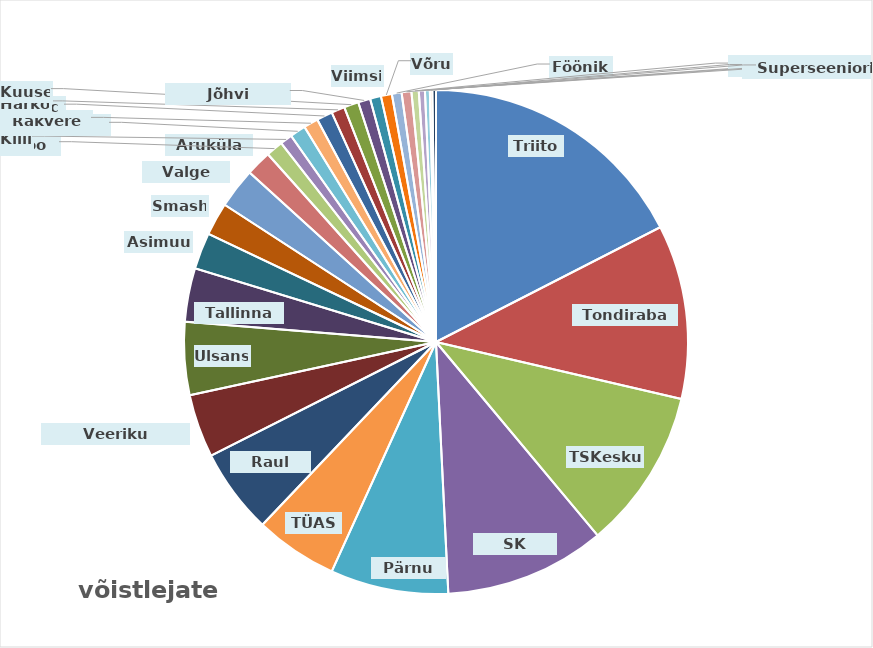
| Category | kokku |
|---|---|
| Triiton | 224 |
| Tondiraba SK | 143 |
| TSKeskus | 132 |
| SK Fookus | 132 |
| Pärnu SK | 97 |
| TÜASK | 68 |
| Raul Must | 70 |
| Veeriku Badminton | 52 |
| Ulsans | 60 |
| Tallinna SK | 44 |
| Asimuut | 30 |
| Smash | 27 |
| Valge Hani | 33 |
| Aruküla SK | 21 |
| Nõo SK | 14 |
| Kiili | 10 |
| Tallinna Kalev | 13 |
| Rakvere SK | 12 |
| TalTech | 13 |
| Harko | 11 |
| Kuuse | 12 |
| Jõhvi Spordikool | 10 |
| Viimsi | 9 |
| Võru | 9 |
| Fööniks | 8 |
| Puhja | 8 |
| Anija Sulgpalliklubi | 6 |
| USTA | 5 |
| Sarv | 4 |
| Viljandi Sulelised | 2 |
| Superseeniorid | 3 |